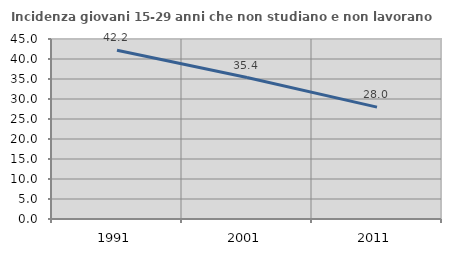
| Category | Incidenza giovani 15-29 anni che non studiano e non lavorano  |
|---|---|
| 1991.0 | 42.173 |
| 2001.0 | 35.371 |
| 2011.0 | 27.968 |